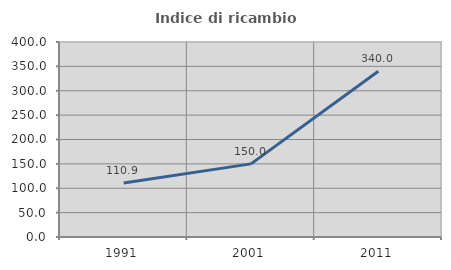
| Category | Indice di ricambio occupazionale  |
|---|---|
| 1991.0 | 110.891 |
| 2001.0 | 150 |
| 2011.0 | 340 |